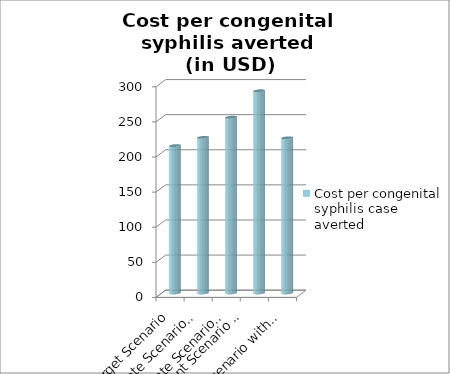
| Category | Cost per congenital syphilis case averted |
|---|---|
| Target Scenario | 209.971 |
| Intermediate Scenario 2 | 221.647 |
| Intermediate Scenario 1 | 250.435 |
| Current Scenario 
with ANC data | 288.08 |
| Current Scenario without ANC data | 221.022 |